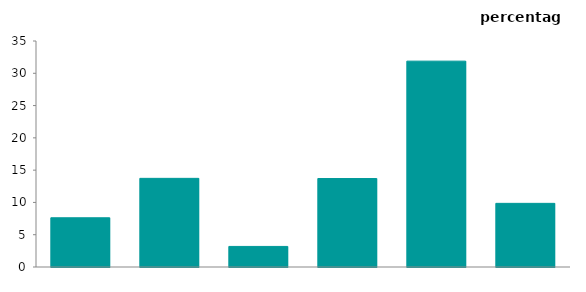
| Category | 2019-20 |
|---|---|
| couple 
non-dep children | 7.624 |
| couple 
dependent 
children | 13.73 |
| lone parent 
non-dep children | 3.186 |
| lone parent 
dependent 
children | 13.703 |
| two or more 
families sharing | 31.883 |
| lone 
person 
sharing | 9.856 |